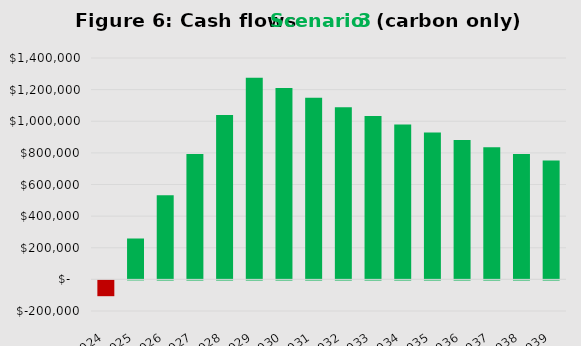
| Category | Series 0 |
|---|---|
| 2024.0 | -100000 |
| 2025.0 | 258500 |
| 2026.0 | 532575 |
| 2027.0 | 792946.25 |
| 2028.0 | 1040298.938 |
| 2029.0 | 1275283.991 |
| 2030.0 | 1210019.791 |
| 2031.0 | 1148018.802 |
| 2032.0 | 1089117.861 |
| 2033.0 | 1033161.968 |
| 2034.0 | 980003.87 |
| 2035.0 | 929503.676 |
| 2036.0 | 881528.493 |
| 2037.0 | 835952.068 |
| 2038.0 | 792654.465 |
| 2039.0 | 751521.741 |